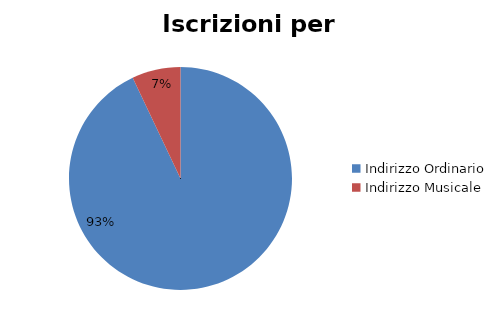
| Category | #REF! |
|---|---|
| Indirizzo Ordinario | 35275 |
| Indirizzo Musicale | 2677 |